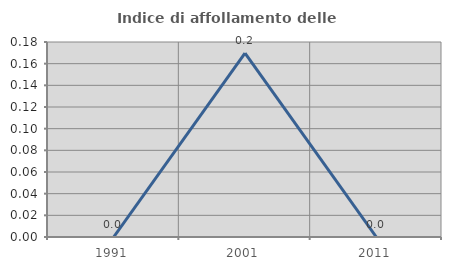
| Category | Indice di affollamento delle abitazioni  |
|---|---|
| 1991.0 | 0 |
| 2001.0 | 0.17 |
| 2011.0 | 0 |